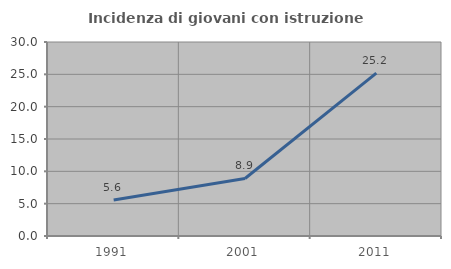
| Category | Incidenza di giovani con istruzione universitaria |
|---|---|
| 1991.0 | 5.578 |
| 2001.0 | 8.898 |
| 2011.0 | 25.185 |